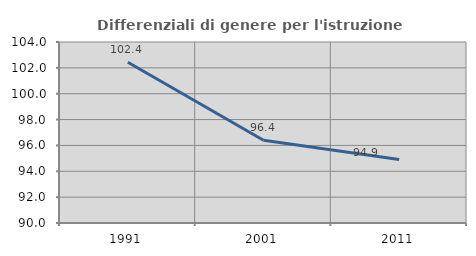
| Category | Differenziali di genere per l'istruzione superiore |
|---|---|
| 1991.0 | 102.436 |
| 2001.0 | 96.399 |
| 2011.0 | 94.903 |